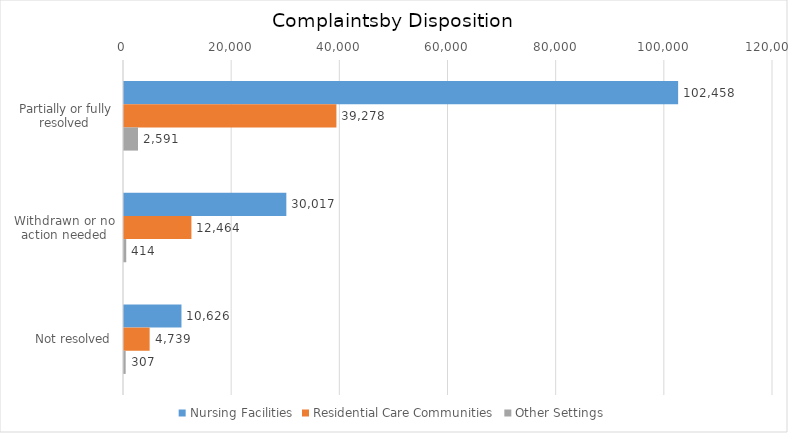
| Category | Nursing Facilities | Residential Care Communities | Other Settings |
|---|---|---|---|
| Partially or fully resolved  | 102458 | 39278 | 2591 |
| Withdrawn or no action needed | 30017 | 12464 | 414 |
| Not resolved | 10626 | 4739 | 307 |